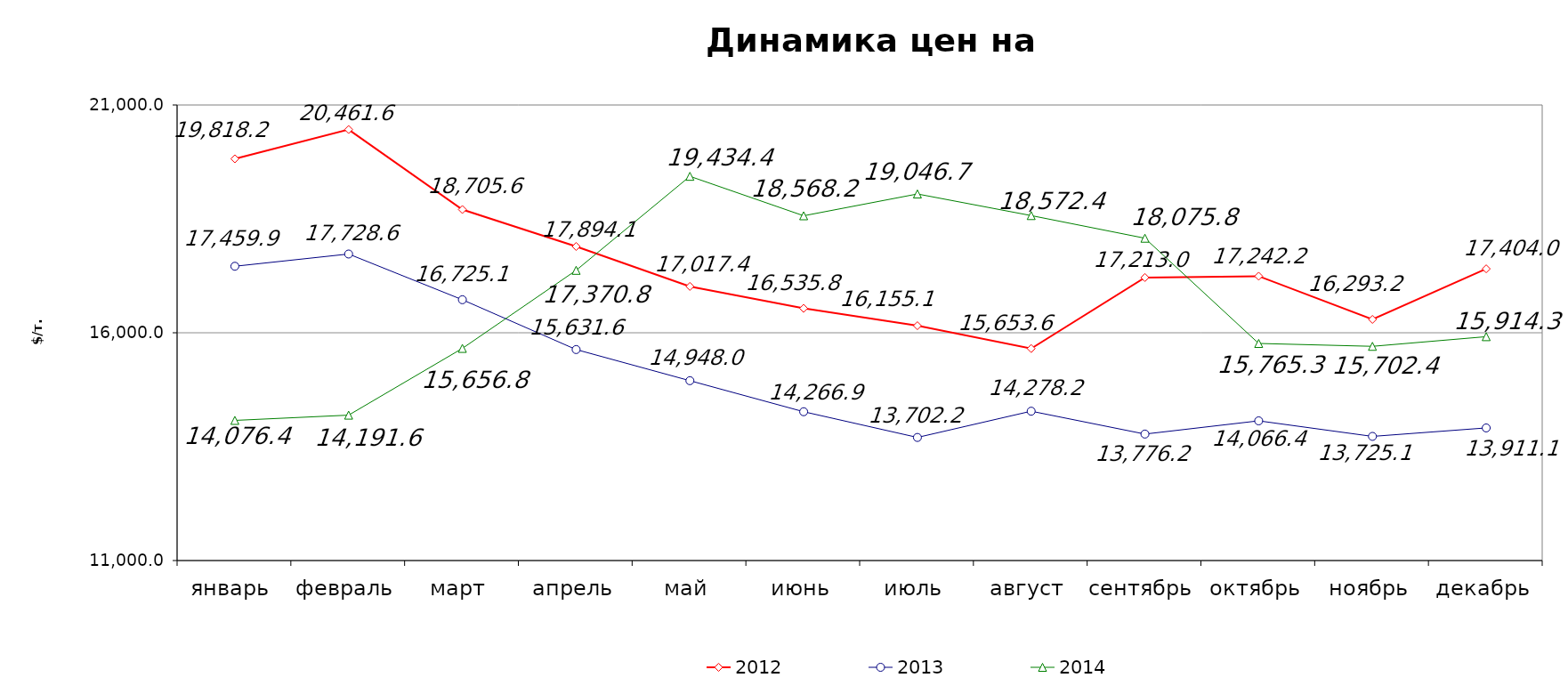
| Category | 2012 | 2013 | 2014 |
|---|---|---|---|
| январь | 19818.21 | 17459.886 | 14076.37 |
| февраль | 20461.55 | 17728.625 | 14191.63 |
| март | 18705.57 | 16725.13 | 15656.79 |
| апрель | 17894.079 | 15631.55 | 17370.75 |
| май | 17017.385 | 14947.98 | 19434.38 |
| июнь | 16535.79 | 14266.875 | 18568.22 |
| июль | 16155.1 | 13702.175 | 19046.737 |
| август | 15653.639 | 14278.22 | 18572.375 |
| сентябрь | 17213 | 13776.19 | 18075.8 |
| октябрь | 17242.17 | 14066.41 | 15765.33 |
| ноябрь | 16293.18 | 13725.12 | 15702.38 |
| декабрь | 17403.95 | 13911.125 | 15914.29 |